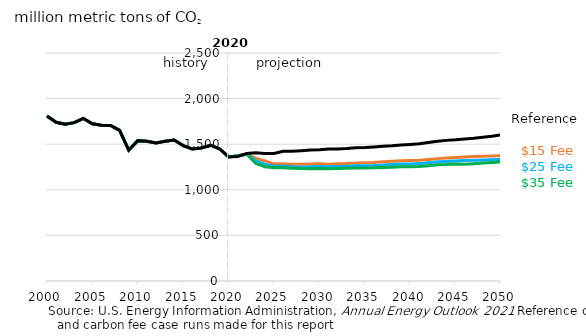
| Category | $15 Fee case | $25 Fee case | $35 Fee case | Reference |
|---|---|---|---|---|
| 2000.0 | 1809.849 | 1809.849 | 1809.849 | 1809.849 |
| 2001.0 | 1740.217 | 1740.217 | 1740.217 | 1740.217 |
| 2002.0 | 1718.625 | 1718.625 | 1718.625 | 1718.625 |
| 2003.0 | 1736.34 | 1736.34 | 1736.34 | 1736.34 |
| 2004.0 | 1783.332 | 1783.332 | 1783.332 | 1783.332 |
| 2005.0 | 1724.238 | 1724.238 | 1724.238 | 1724.238 |
| 2006.0 | 1708.665 | 1708.665 | 1708.665 | 1708.665 |
| 2007.0 | 1706.322 | 1706.322 | 1706.322 | 1706.322 |
| 2008.0 | 1651.636 | 1651.636 | 1651.636 | 1651.636 |
| 2009.0 | 1435.531 | 1435.531 | 1435.531 | 1435.531 |
| 2010.0 | 1538.974 | 1538.974 | 1538.974 | 1538.974 |
| 2011.0 | 1532.178 | 1532.178 | 1532.178 | 1532.178 |
| 2012.0 | 1513.932 | 1513.932 | 1513.932 | 1513.932 |
| 2013.0 | 1531.67 | 1531.67 | 1531.67 | 1531.67 |
| 2014.0 | 1545.494 | 1545.494 | 1545.494 | 1545.494 |
| 2015.0 | 1484.353 | 1484.353 | 1484.353 | 1484.353 |
| 2016.0 | 1448.431 | 1448.431 | 1448.431 | 1448.431 |
| 2017.0 | 1458.347 | 1458.347 | 1458.347 | 1458.347 |
| 2018.0 | 1488.748 | 1488.748 | 1488.748 | 1488.748 |
| 2019.0 | 1450.131 | 1450.131 | 1450.131 | 1450.131 |
| 2020.0 | 1360.033 | 1360.033 | 1360.033 | 1360.033 |
| 2021.0 | 1372.187 | 1372.286 | 1372.375 | 1365.475 |
| 2022.0 | 1390.355 | 1390.182 | 1390.077 | 1398.693 |
| 2023.0 | 1346.507 | 1316.782 | 1288.909 | 1405.253 |
| 2024.0 | 1317.595 | 1280.594 | 1253.76 | 1398.414 |
| 2025.0 | 1284.352 | 1257.608 | 1242.589 | 1398.789 |
| 2026.0 | 1284.2 | 1257.436 | 1240.579 | 1423.471 |
| 2027.0 | 1278.862 | 1252.226 | 1235.915 | 1422.181 |
| 2028.0 | 1279.94 | 1250.703 | 1232.198 | 1428.186 |
| 2029.0 | 1282.5 | 1252.427 | 1231.14 | 1435.395 |
| 2030.0 | 1284.268 | 1256.431 | 1234.866 | 1439.207 |
| 2031.0 | 1281.119 | 1252.048 | 1229.918 | 1446.519 |
| 2032.0 | 1285.016 | 1255.734 | 1233.793 | 1447.59 |
| 2033.0 | 1287.836 | 1258.649 | 1235.019 | 1451.98 |
| 2034.0 | 1293.674 | 1263.86 | 1237.818 | 1460.822 |
| 2035.0 | 1296.132 | 1264.187 | 1238.747 | 1463.065 |
| 2036.0 | 1299.665 | 1265.919 | 1240.668 | 1470.335 |
| 2037.0 | 1306.413 | 1271.658 | 1244.787 | 1477.214 |
| 2038.0 | 1311.892 | 1276.567 | 1247.73 | 1482.014 |
| 2039.0 | 1318.665 | 1283.315 | 1252.676 | 1491.041 |
| 2040.0 | 1320.176 | 1282.574 | 1253.482 | 1497.341 |
| 2041.0 | 1323.298 | 1287.029 | 1255.918 | 1504.68 |
| 2042.0 | 1332.4 | 1296.405 | 1264.598 | 1519.153 |
| 2043.0 | 1341.851 | 1307.238 | 1275.315 | 1532.321 |
| 2044.0 | 1348.222 | 1311.442 | 1277.621 | 1541.929 |
| 2045.0 | 1353.977 | 1316.994 | 1282.92 | 1547.584 |
| 2046.0 | 1359.616 | 1321.369 | 1280.831 | 1555.885 |
| 2047.0 | 1365.736 | 1324.353 | 1286.572 | 1565.448 |
| 2048.0 | 1367.203 | 1326.714 | 1294.43 | 1577.361 |
| 2049.0 | 1370.206 | 1329.48 | 1300.034 | 1588.314 |
| 2050.0 | 1375.208 | 1333.054 | 1305.169 | 1601.854 |